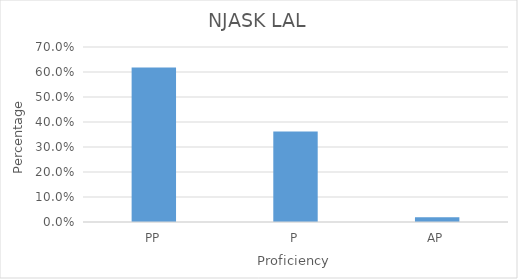
| Category | Series 0 |
|---|---|
| PP | 0.618 |
| P | 0.362 |
| AP | 0.019 |